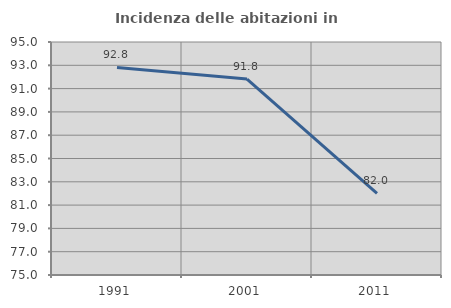
| Category | Incidenza delle abitazioni in proprietà  |
|---|---|
| 1991.0 | 92.812 |
| 2001.0 | 91.822 |
| 2011.0 | 82.008 |